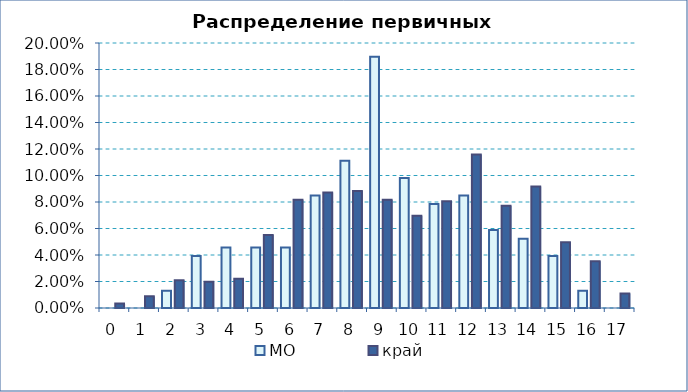
| Category | МО | край |
|---|---|---|
| 0.0 | 0 | 0.003 |
| 1.0 | 0 | 0.009 |
| 2.0 | 0.013 | 0.021 |
| 3.0 | 0.039 | 0.02 |
| 4.0 | 0.046 | 0.022 |
| 5.0 | 0.046 | 0.055 |
| 6.0 | 0.046 | 0.082 |
| 7.0 | 0.085 | 0.087 |
| 8.0 | 0.111 | 0.088 |
| 9.0 | 0.19 | 0.082 |
| 10.0 | 0.098 | 0.07 |
| 11.0 | 0.078 | 0.081 |
| 12.0 | 0.085 | 0.116 |
| 13.0 | 0.059 | 0.077 |
| 14.0 | 0.052 | 0.092 |
| 15.0 | 0.039 | 0.05 |
| 16.0 | 0.013 | 0.035 |
| 17.0 | 0 | 0.011 |